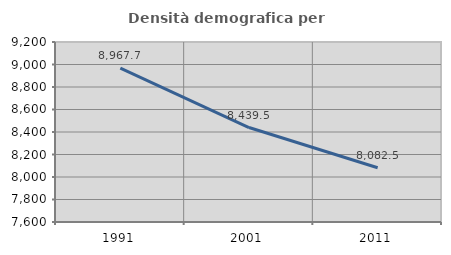
| Category | Densità demografica |
|---|---|
| 1991.0 | 8967.698 |
| 2001.0 | 8439.524 |
| 2011.0 | 8082.476 |